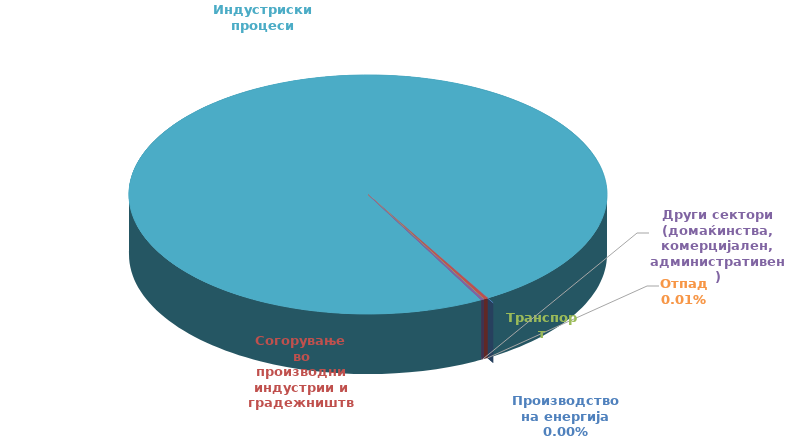
| Category | Series 0 |
|---|---|
| 0 | 0 |
| 1 | 0.675 |
| 2 | 0 |
| 3 | 0.485 |
| 4 | 236.058 |
| 5 | 0.021 |